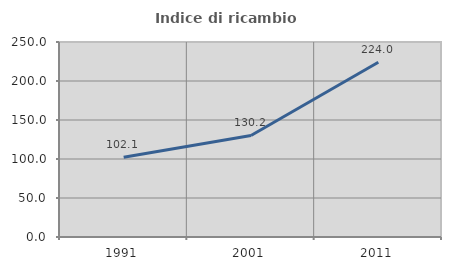
| Category | Indice di ricambio occupazionale  |
|---|---|
| 1991.0 | 102.143 |
| 2001.0 | 130.159 |
| 2011.0 | 224 |